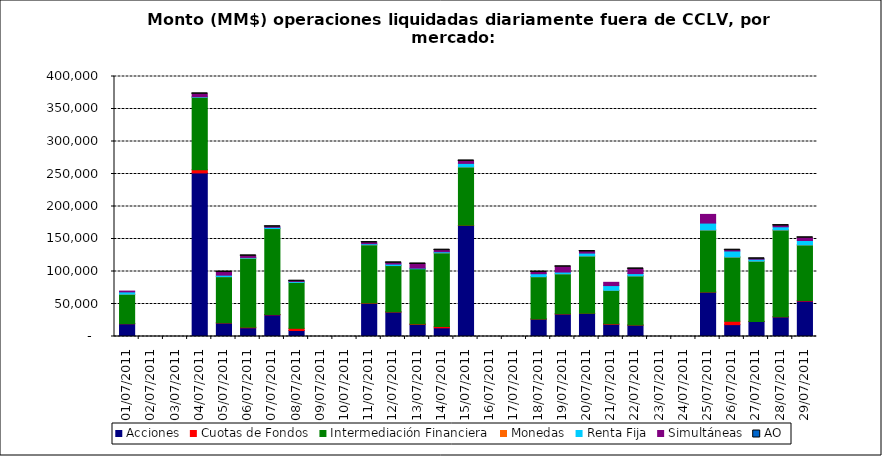
| Category | Acciones | Cuotas de Fondos | Intermediación Financiera | Monedas | Renta Fija | Simultáneas | AO |
|---|---|---|---|---|---|---|---|
| 01/07/2011 | 19616.524 | 183.546 | 45259.077 | 17.418 | 3570.776 | 1224.201 | 0 |
| 04/07/2011 | 251658.9 | 4970.763 | 111408.122 | 5.82 | 865.59 | 4411.649 | 0.05 |
| 05/07/2011 | 20803.96 | 280.098 | 70971.335 | 23.388 | 2299.539 | 4767.406 | 0.041 |
| 06/07/2011 | 13430.364 | 924.433 | 106150.563 | 7.02 | 1133.916 | 2425.894 | 0.241 |
| 07/07/2011 | 33351.114 | 502.168 | 132224.511 | 4.095 | 1911.063 | 912.892 | 0.259 |
| 08/07/2011 | 9247.874 | 3347.692 | 70577.161 | 33.134 | 1515.056 | 380.061 | 0.098 |
| 11/07/2011 | 50999.943 | 610.683 | 89478.128 | 31.514 | 1613.163 | 1770.021 | 0.375 |
| 12/07/2011 | 37625.042 | 326.418 | 71180.977 | 31.694 | 2293.583 | 1861.805 | 0.235 |
| 13/07/2011 | 18503.146 | 862.279 | 84828.268 | 0 | 938.366 | 6480.302 | 0.218 |
| 14/07/2011 | 13353.613 | 2120.246 | 113256.19 | 11.324 | 1624.929 | 2463.74 | 0.105 |
| 15/07/2011 | 170814.916 | 303.706 | 89738.61 | 1.192 | 5458.924 | 3791.876 | 0.036 |
| 18/07/2011 | 26879.62 | 104.843 | 65033.314 | 11.425 | 4570.292 | 2551.91 | 0.202 |
| 19/07/2011 | 34610.678 | 366.307 | 61455.031 | 7.865 | 2716.262 | 8116.018 | 0.036 |
| 20/07/2011 | 35665.086 | 74.664 | 88160.54 | 2.42 | 4427.122 | 2394.847 | 0.016 |
| 21/07/2011 | 18777.523 | 769.934 | 51501.127 | 1.496 | 7289.403 | 5010.56 | 0 |
| 22/07/2011 | 17485.551 | 225.715 | 75490.551 | 2.472 | 3570.404 | 7234.956 | 0.007 |
| 25/07/2011 | 68244.872 | 281.714 | 95323.816 | 13.138 | 10622.38 | 13353.236 | 0 |
| 26/07/2011 | 18247.896 | 5236.652 | 98678.314 | 114.274 | 9299.071 | 1188.916 | 0.042 |
| 27/07/2011 | 23122.325 | 96.527 | 92640.441 | 67.534 | 2951.971 | 675.098 | 0.01 |
| 28/07/2011 | 30186.693 | 142.131 | 133519.533 | 73.3 | 4869.094 | 1826.913 | 0.518 |
| 29/07/2011 | 54525.192 | 735.97 | 85605.072 | 9.1 | 6772.419 | 4241.903 | 0.635 |